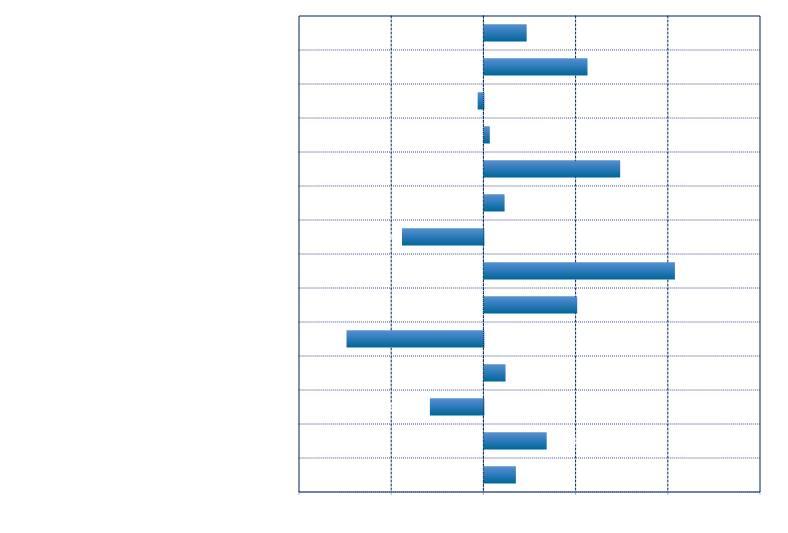
| Category | Series 3 |
|---|---|
| Euro FX (Globex), Mar 18 | 0.002 |
| Gold (Globex), Feb 18 | 0.003 |
| Nikkei 225 (Osaka), Mar 18 | -0.003 |
| S&P Banks Index | 0.001 |
| Ibovespa Index, Feb 18 | -0.007 |
| Guggenheim S&P 500 Eq Wt Technology ETF | 0.005 |
| SPDR S&P Biotech ETF | 0.01 |
| CAC40, Feb 18 | -0.004 |
| Euro STOXX 50, Mar 18 | 0.001 |
| DAX Index, Mar 18 | 0.007 |
| DJ Industrial Average | 0 |
| Russell 2000 Index Mini, Mar 18 | 0 |
| E-mini NASDAQ-100, Mar 18 | 0.006 |
| E-Mini S&P 500, Mar 18 | 0.002 |